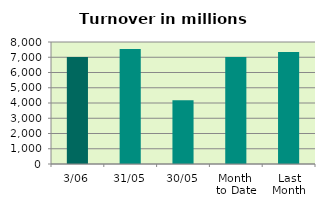
| Category | Series 0 |
|---|---|
| 3/06 | 7020.55 |
| 31/05 | 7540.423 |
| 30/05 | 4176.658 |
| Month 
to Date | 7020.55 |
| Last
Month | 7336.2 |